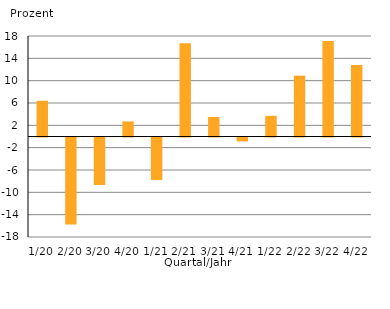
| Category | Veränd. zum Vorjahresquartal in % |
|---|---|
| 1/20 | 6.4 |
| 2/20 | -15.6 |
| 3/20 | -8.5 |
| 4/20 | 2.7 |
| 1/21 | -7.6 |
| 2/21 | 16.7 |
| 3/21 | 3.5 |
| 4/21 | -0.7 |
| 1/22 | 3.7 |
| 2/22 | 10.9 |
| 3/22 | 17.1 |
| 4/22 | 12.8 |